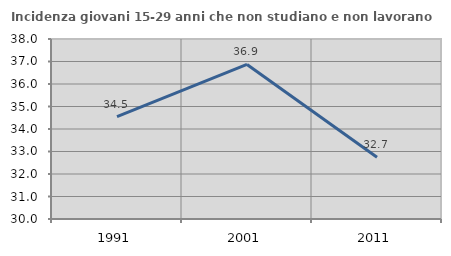
| Category | Incidenza giovani 15-29 anni che non studiano e non lavorano  |
|---|---|
| 1991.0 | 34.545 |
| 2001.0 | 36.87 |
| 2011.0 | 32.743 |